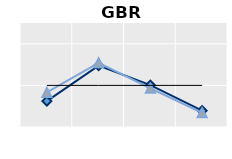
| Category | Foreign-born | Native-born | Series 1 |
|---|---|---|---|
| 15-24 | 0.622 | 0.83 | 1 |
| 25-54 | 1.475 | 1.542 | 1 |
| 55-64 | 1.006 | 0.931 | 1 |
| 65+ | 0.392 | 0.343 | 1 |